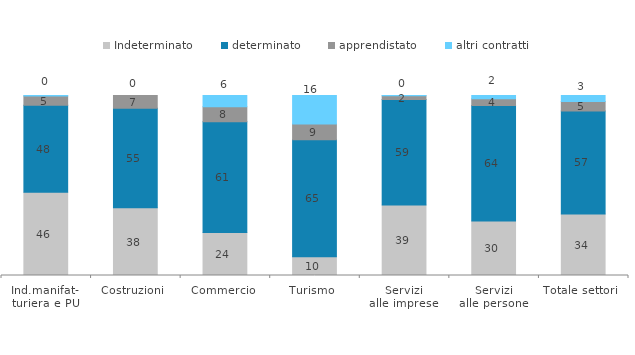
| Category | Indeterminato | determinato | apprendistato | altri contratti |
|---|---|---|---|---|
| Ind.manifat-
turiera e PU | 46.245 | 48.283 | 5.15 | 0.322 |
| Costruzioni | 37.666 | 55.244 | 7.09 | 0 |
| Commercio | 23.937 | 61.417 | 8.346 | 6.299 |
| Turismo | 10.376 | 65.107 | 8.647 | 15.87 |
| Servizi
alle imprese | 39.19 | 58.629 | 2.056 | 0.125 |
| Servizi
alle persone | 30.21 | 64.196 | 3.776 | 1.818 |
| Totale settori | 34.203 | 57.169 | 5.279 | 3.349 |